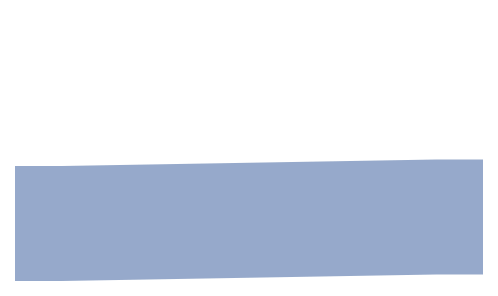
| Category | Series 0 | Series 1 | Series 2 |
|---|---|---|---|
| 0.0 | 4600 | 3500 | 0 |
| 10.0 | 4600 | 3500 | 0 |
| 90.0 | 4400 | 3500 | 200 |
| 100.0 | 4400 | 3500 | 200 |